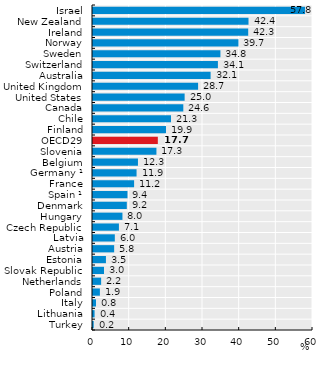
| Category | 2017 (or nearest year) |
|---|---|
| Israel | 57.84 |
| New Zealand | 42.41 |
| Ireland | 42.33 |
| Norway | 39.665 |
| Sweden | 34.75 |
| Switzerland | 34.065 |
| Australia | 32.074 |
| United Kingdom | 28.663 |
| United States | 24.99 |
| Canada | 24.63 |
| Chile | 21.27 |
| Finland | 19.908 |
| OECD29 | 17.681 |
| Slovenia | 17.3 |
| Belgium | 12.26 |
| Germany ¹ | 11.88 |
| France | 11.21 |
| Spain ¹ | 9.4 |
| Denmark | 9.22 |
| Hungary | 8.03 |
| Czech Republic | 7.07 |
| Latvia | 5.95 |
| Austria | 5.77 |
| Estonia | 3.53 |
| Slovak Republic | 2.994 |
| Netherlands | 2.218 |
| Poland | 1.88 |
| Italy | 0.82 |
| Lithuania | 0.43 |
| Turkey | 0.19 |